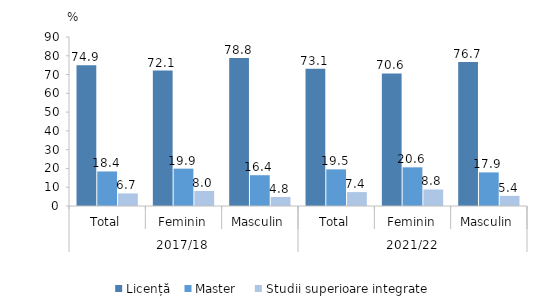
| Category | Licență | Master  | Studii superioare integrate |
|---|---|---|---|
| 0 | 74.9 | 18.4 | 6.7 |
| 1 | 72.1 | 19.9 | 8 |
| 2 | 78.8 | 16.4 | 4.8 |
| 3 | 73.1 | 19.5 | 7.4 |
| 4 | 70.6 | 20.6 | 8.8 |
| 5 | 76.7 | 17.9 | 5.4 |